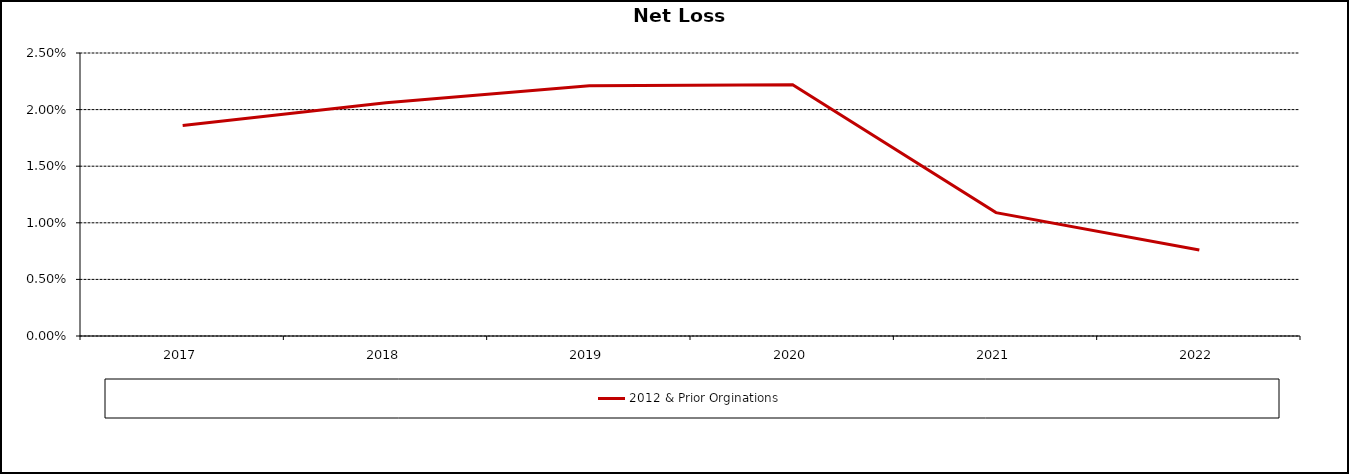
| Category | 2012 & Prior Orginations |
|---|---|
| 2017.0 | 0.019 |
| 2018.0 | 0.021 |
| 2019.0 | 0.022 |
| 2020.0 | 0.022 |
| 2021.0 | 0.011 |
| 44926.0 | 0.008 |